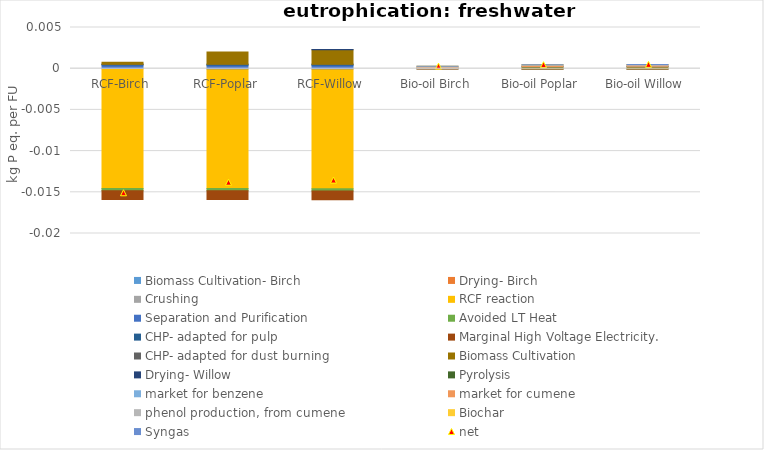
| Category | Biomass Cultivation- Birch | Drying- Birch | Crushing | RCF reaction | Separation and Purification | Avoided LT Heat  | CHP- adapted for pulp | Marginal High Voltage Electricity.  | CHP- adapted for dust burning | Biomass Cultivation | Drying- Willow | Pyrolysis | market for benzene | market for cumene | phenol production, from cumene | Biochar | Syngas |
|---|---|---|---|---|---|---|---|---|---|---|---|---|---|---|---|---|---|
| RCF-Birch | 0 | 0 | 0 | -0.015 | 0 | 0 | 0 | -0.001 | 0 | 0 | 0 | 0 | 0 | 0 | 0 | 0 | 0 |
| RCF-Poplar | 0 | 0 | 0 | -0.015 | 0 | 0 | 0 | -0.001 | 0 | 0.002 | 0 | 0 | 0 | 0 | 0 | 0 | 0 |
| RCF-Willow | 0 | 0 | 0 | -0.015 | 0 | 0 | 0 | -0.001 | 0 | 0.002 | 0 | 0 | 0 | 0 | 0 | 0 | 0 |
| Bio-oil Birch | 0 | 0 | 0 | 0 | 0 | 0 | 0 | 0 | 0 | 0 | 0 | 0 | 0 | 0 | 0 | 0 | 0 |
| Bio-oil Poplar | 0 | 0 | 0 | 0 | 0 | 0 | 0 | 0 | 0 | 0 | 0 | 0 | 0 | 0 | 0 | 0 | 0 |
| Bio-oil Willow | 0 | 0 | 0 | 0 | 0 | 0 | 0 | 0 | 0 | 0 | 0 | 0 | 0 | 0 | 0 | 0 | 0 |